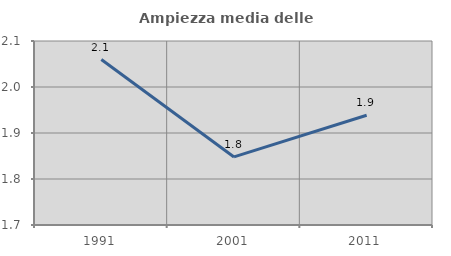
| Category | Ampiezza media delle famiglie |
|---|---|
| 1991.0 | 2.06 |
| 2001.0 | 1.848 |
| 2011.0 | 1.939 |